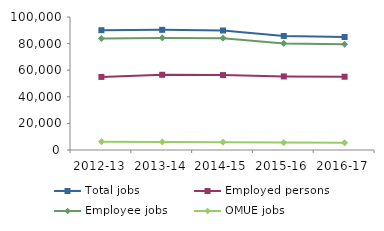
| Category | Total jobs | Employed persons | Employee jobs | OMUE jobs |
|---|---|---|---|---|
| 2012-13 | 90066 | 54947 | 83785 | 6279 |
| 2013-14 | 90339 | 56546 | 84256 | 6085 |
| 2014-15 | 89870 | 56318 | 84045 | 5828 |
| 2015-16 | 85735 | 55328 | 80166 | 5568 |
| 2016-17 | 84967 | 55091 | 79465 | 5502 |